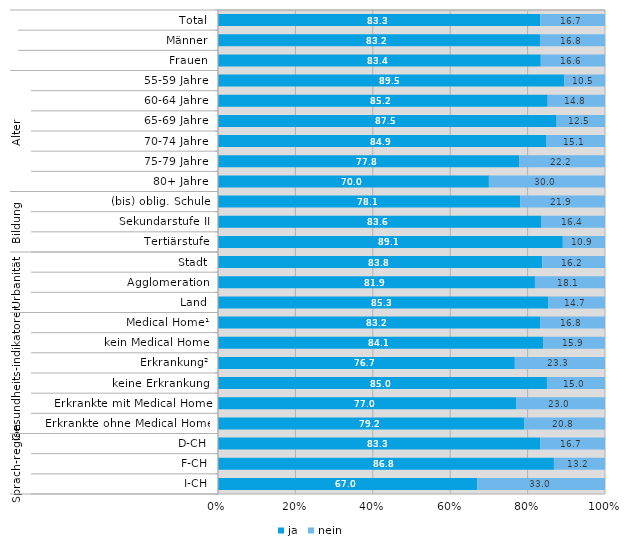
| Category | ja | nein |
|---|---|---|
| 0 | 83.3 | 16.7 |
| 1 | 83.2 | 16.8 |
| 2 | 83.4 | 16.6 |
| 3 | 89.5 | 10.5 |
| 4 | 85.2 | 14.8 |
| 5 | 87.5 | 12.5 |
| 6 | 84.9 | 15.1 |
| 7 | 77.8 | 22.2 |
| 8 | 70 | 30 |
| 9 | 78.1 | 21.9 |
| 10 | 83.6 | 16.4 |
| 11 | 89.1 | 10.9 |
| 12 | 83.8 | 16.2 |
| 13 | 81.9 | 18.1 |
| 14 | 85.3 | 14.7 |
| 15 | 83.2 | 16.8 |
| 16 | 84.1 | 15.9 |
| 17 | 76.7 | 23.3 |
| 18 | 85 | 15 |
| 19 | 77 | 23 |
| 20 | 79.2 | 20.8 |
| 21 | 83.3 | 16.7 |
| 22 | 86.8 | 13.2 |
| 23 | 67 | 33 |